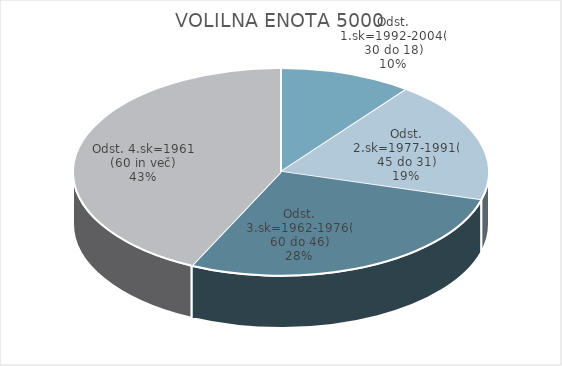
| Category | VOLILNA ENOTA 5000 |
|---|---|
| Odst. 1.sk=1992-2004(30 do 18) | 5.36 |
| Odst. 2.sk=1977-1991(45 do 31) | 9.86 |
| Odst. 3.sk=1962-1976(60 do 46) | 14.33 |
| Odst. 4.sk=1961 (60 in več) | 22.24 |